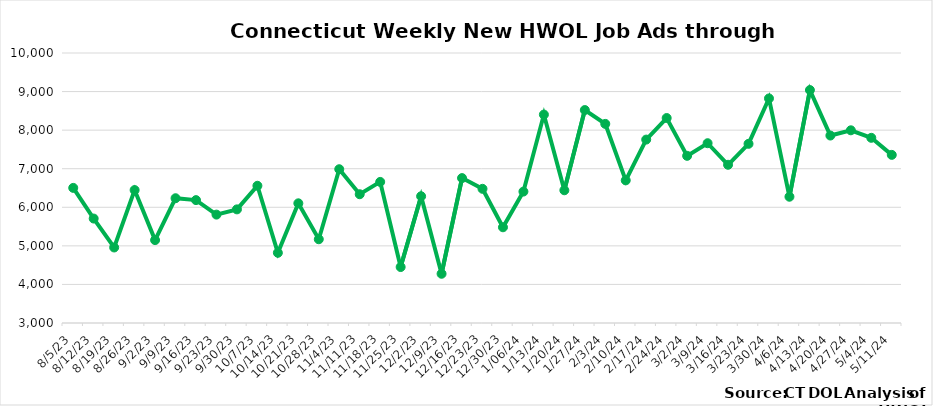
| Category | Connecticut |
|---|---|
| 8/5/23 | 6503 |
| 8/12/23 | 5708 |
| 8/19/23 | 4958 |
| 8/26/23 | 6447 |
| 9/2/23 | 5149 |
| 9/9/23 | 6235 |
| 9/16/23 | 6186 |
| 9/23/23 | 5810 |
| 9/30/23 | 5946 |
| 10/7/23 | 6558 |
| 10/14/23 | 4820 |
| 10/21/23 | 6103 |
| 10/28/23 | 5171 |
| 11/4/23 | 6987 |
| 11/11/23 | 6338 |
| 11/18/23 | 6658 |
| 11/25/23 | 4451 |
| 12/2/23 | 6286 |
| 12/9/23 | 4276 |
| 12/16/23 | 6757 |
|  12/23/23 | 6479 |
|  12/30/23 | 5482 |
|  1/06/24 | 6407 |
|  1/13/24 | 8403 |
|  1/20/24 | 6441 |
|  1/27/24 | 8521 |
|  2/3/24 | 8162 |
|  2/10/24 | 6698 |
|  2/17/24 | 7755 |
|  2/24/24 | 8314 |
|  3/2/24 | 7334 |
|  3/9/24 | 7661 |
|  3/16/24 | 7102 |
|  3/23/24 | 7645 |
|  3/30/24 | 8822 |
|  4/6/24 | 6273 |
|  4/13/24 | 9039 |
|  4/20/24 | 7860 |
|  4/27/24 | 7996 |
|  5/4/24 | 7801 |
|  5/11/24 | 7359 |